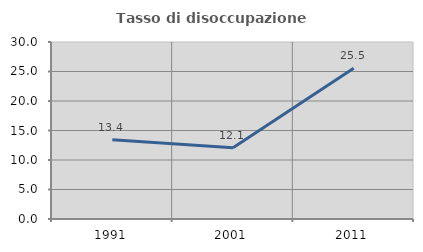
| Category | Tasso di disoccupazione giovanile  |
|---|---|
| 1991.0 | 13.426 |
| 2001.0 | 12.057 |
| 2011.0 | 25.532 |